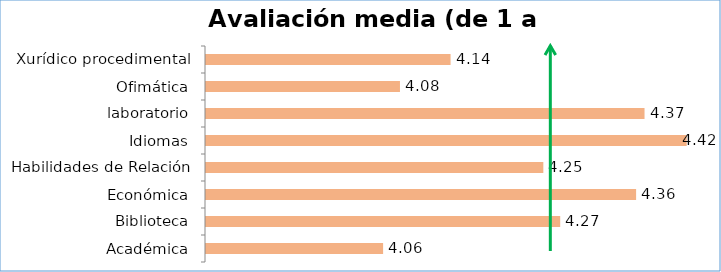
| Category | Avaliación media |
|---|---|
| Académica | 4.06 |
| Biblioteca | 4.27 |
| Económica | 4.36 |
| Habilidades de Relación | 4.25 |
| Idiomas | 4.42 |
| laboratorio | 4.37 |
| Ofimática | 4.08 |
| Xurídico procedimental | 4.14 |